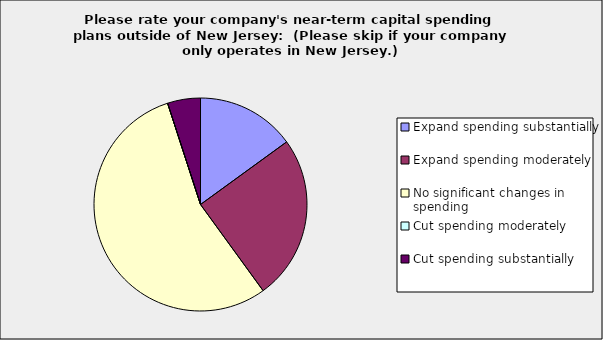
| Category | Series 0 |
|---|---|
| Expand spending substantially | 0.15 |
| Expand spending moderately | 0.25 |
| No significant changes in spending | 0.55 |
| Cut spending moderately | 0 |
| Cut spending substantially | 0.05 |